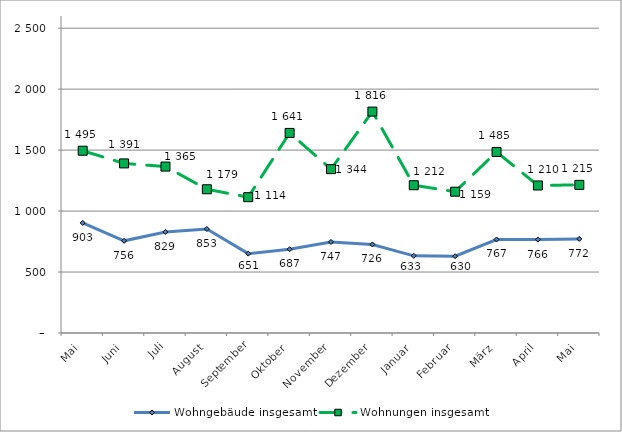
| Category | Wohngebäude insgesamt | Wohnungen insgesamt |
|---|---|---|
| Mai | 903 | 1495 |
| Juni | 756 | 1391 |
| Juli | 829 | 1365 |
| August | 853 | 1179 |
| September | 651 | 1114 |
| Oktober | 687 | 1641 |
| November | 747 | 1344 |
| Dezember | 726 | 1816 |
| Januar | 633 | 1212 |
| Februar | 630 | 1159 |
| März | 767 | 1485 |
| April | 766 | 1210 |
| Mai | 772 | 1215 |